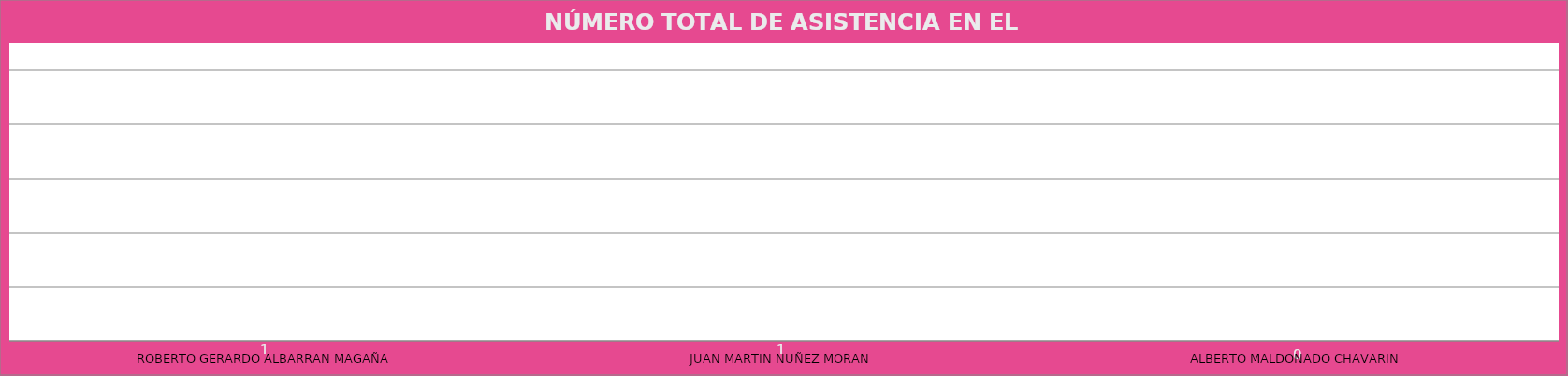
| Category | ROBERTO GERARDO ALBARRAN MAGAÑA |
|---|---|
| ROBERTO GERARDO ALBARRAN MAGAÑA | 1 |
| JUAN MARTIN NUÑEZ MORAN  | 1 |
| ALBERTO MALDONADO CHAVARIN  | 0 |